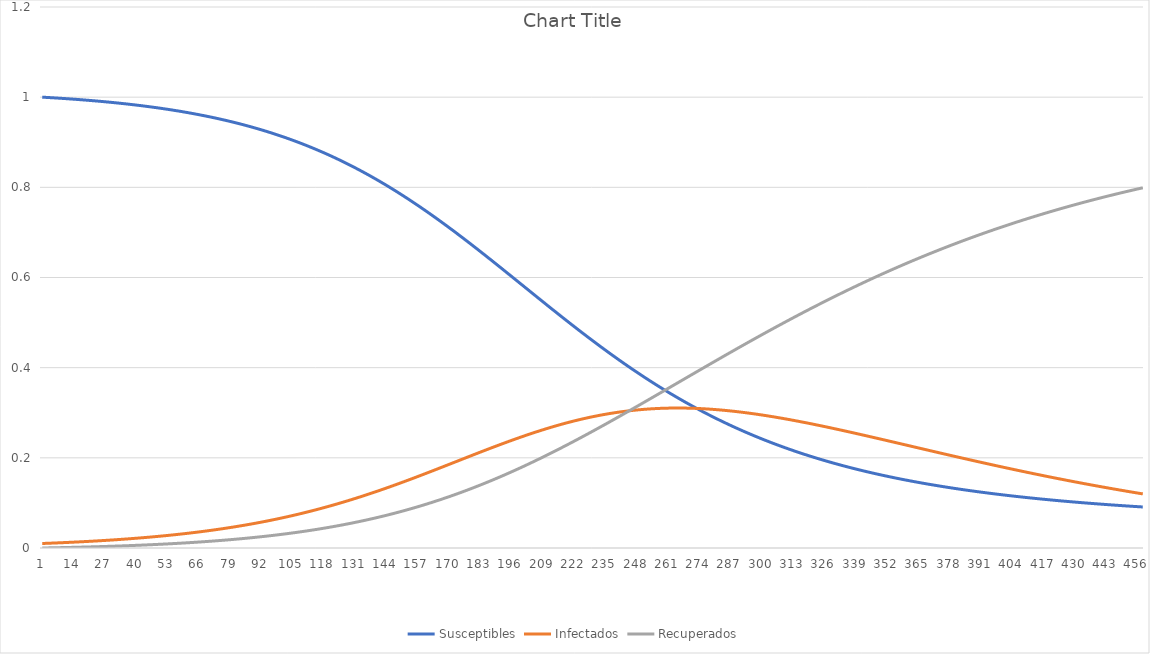
| Category | Susceptibles | Infectados | Recuperados |
|---|---|---|---|
| 0 | 1 | 0.01 | 0 |
| 1 | 1 | 0.01 | 0 |
| 2 | 0.999 | 0.01 | 0 |
| 3 | 0.999 | 0.011 | 0 |
| 4 | 0.999 | 0.011 | 0 |
| 5 | 0.998 | 0.011 | 0.001 |
| 6 | 0.998 | 0.011 | 0.001 |
| 7 | 0.998 | 0.011 | 0.001 |
| 8 | 0.997 | 0.012 | 0.001 |
| 9 | 0.997 | 0.012 | 0.001 |
| 10 | 0.997 | 0.012 | 0.001 |
| 11 | 0.996 | 0.012 | 0.001 |
| 12 | 0.996 | 0.013 | 0.001 |
| 13 | 0.996 | 0.013 | 0.001 |
| 14 | 0.995 | 0.013 | 0.002 |
| 15 | 0.995 | 0.013 | 0.002 |
| 16 | 0.994 | 0.014 | 0.002 |
| 17 | 0.994 | 0.014 | 0.002 |
| 18 | 0.994 | 0.014 | 0.002 |
| 19 | 0.993 | 0.015 | 0.002 |
| 20 | 0.993 | 0.015 | 0.002 |
| 21 | 0.992 | 0.015 | 0.003 |
| 22 | 0.992 | 0.015 | 0.003 |
| 23 | 0.991 | 0.016 | 0.003 |
| 24 | 0.991 | 0.016 | 0.003 |
| 25 | 0.99 | 0.016 | 0.003 |
| 26 | 0.99 | 0.017 | 0.003 |
| 27 | 0.989 | 0.017 | 0.004 |
| 28 | 0.989 | 0.017 | 0.004 |
| 29 | 0.988 | 0.018 | 0.004 |
| 30 | 0.988 | 0.018 | 0.004 |
| 31 | 0.987 | 0.018 | 0.004 |
| 32 | 0.987 | 0.019 | 0.004 |
| 33 | 0.986 | 0.019 | 0.005 |
| 34 | 0.986 | 0.02 | 0.005 |
| 35 | 0.985 | 0.02 | 0.005 |
| 36 | 0.984 | 0.02 | 0.005 |
| 37 | 0.984 | 0.021 | 0.005 |
| 38 | 0.983 | 0.021 | 0.006 |
| 39 | 0.982 | 0.022 | 0.006 |
| 40 | 0.982 | 0.022 | 0.006 |
| 41 | 0.981 | 0.022 | 0.006 |
| 42 | 0.981 | 0.023 | 0.007 |
| 43 | 0.98 | 0.023 | 0.007 |
| 44 | 0.979 | 0.024 | 0.007 |
| 45 | 0.978 | 0.024 | 0.007 |
| 46 | 0.978 | 0.025 | 0.008 |
| 47 | 0.977 | 0.025 | 0.008 |
| 48 | 0.976 | 0.026 | 0.008 |
| 49 | 0.975 | 0.026 | 0.008 |
| 50 | 0.975 | 0.027 | 0.009 |
| 51 | 0.974 | 0.027 | 0.009 |
| 52 | 0.973 | 0.028 | 0.009 |
| 53 | 0.972 | 0.028 | 0.009 |
| 54 | 0.971 | 0.029 | 0.01 |
| 55 | 0.971 | 0.029 | 0.01 |
| 56 | 0.97 | 0.03 | 0.01 |
| 57 | 0.969 | 0.031 | 0.011 |
| 58 | 0.968 | 0.031 | 0.011 |
| 59 | 0.967 | 0.032 | 0.011 |
| 60 | 0.966 | 0.032 | 0.011 |
| 61 | 0.965 | 0.033 | 0.012 |
| 62 | 0.964 | 0.034 | 0.012 |
| 63 | 0.963 | 0.034 | 0.012 |
| 64 | 0.962 | 0.035 | 0.013 |
| 65 | 0.961 | 0.036 | 0.013 |
| 66 | 0.96 | 0.036 | 0.014 |
| 67 | 0.959 | 0.037 | 0.014 |
| 68 | 0.958 | 0.038 | 0.014 |
| 69 | 0.957 | 0.038 | 0.015 |
| 70 | 0.956 | 0.039 | 0.015 |
| 71 | 0.955 | 0.04 | 0.015 |
| 72 | 0.954 | 0.041 | 0.016 |
| 73 | 0.952 | 0.041 | 0.016 |
| 74 | 0.951 | 0.042 | 0.017 |
| 75 | 0.95 | 0.043 | 0.017 |
| 76 | 0.949 | 0.044 | 0.018 |
| 77 | 0.948 | 0.045 | 0.018 |
| 78 | 0.946 | 0.045 | 0.018 |
| 79 | 0.945 | 0.046 | 0.019 |
| 80 | 0.944 | 0.047 | 0.019 |
| 81 | 0.942 | 0.048 | 0.02 |
| 82 | 0.941 | 0.049 | 0.02 |
| 83 | 0.94 | 0.05 | 0.021 |
| 84 | 0.938 | 0.051 | 0.021 |
| 85 | 0.937 | 0.052 | 0.022 |
| 86 | 0.935 | 0.052 | 0.022 |
| 87 | 0.934 | 0.053 | 0.023 |
| 88 | 0.932 | 0.054 | 0.023 |
| 89 | 0.931 | 0.055 | 0.024 |
| 90 | 0.929 | 0.056 | 0.025 |
| 91 | 0.928 | 0.057 | 0.025 |
| 92 | 0.926 | 0.058 | 0.026 |
| 93 | 0.924 | 0.059 | 0.026 |
| 94 | 0.923 | 0.061 | 0.027 |
| 95 | 0.921 | 0.062 | 0.027 |
| 96 | 0.919 | 0.063 | 0.028 |
| 97 | 0.917 | 0.064 | 0.029 |
| 98 | 0.916 | 0.065 | 0.029 |
| 99 | 0.914 | 0.066 | 0.03 |
| 100 | 0.912 | 0.067 | 0.031 |
| 101 | 0.91 | 0.068 | 0.031 |
| 102 | 0.908 | 0.07 | 0.032 |
| 103 | 0.906 | 0.071 | 0.033 |
| 104 | 0.905 | 0.072 | 0.033 |
| 105 | 0.903 | 0.073 | 0.034 |
| 106 | 0.901 | 0.075 | 0.035 |
| 107 | 0.899 | 0.076 | 0.036 |
| 108 | 0.896 | 0.077 | 0.036 |
| 109 | 0.894 | 0.078 | 0.037 |
| 110 | 0.892 | 0.08 | 0.038 |
| 111 | 0.89 | 0.081 | 0.039 |
| 112 | 0.888 | 0.082 | 0.04 |
| 113 | 0.886 | 0.084 | 0.04 |
| 114 | 0.883 | 0.085 | 0.041 |
| 115 | 0.881 | 0.087 | 0.042 |
| 116 | 0.879 | 0.088 | 0.043 |
| 117 | 0.877 | 0.09 | 0.044 |
| 118 | 0.874 | 0.091 | 0.045 |
| 119 | 0.872 | 0.092 | 0.046 |
| 120 | 0.869 | 0.094 | 0.047 |
| 121 | 0.867 | 0.096 | 0.048 |
| 122 | 0.864 | 0.097 | 0.049 |
| 123 | 0.862 | 0.099 | 0.05 |
| 124 | 0.859 | 0.1 | 0.051 |
| 125 | 0.857 | 0.102 | 0.052 |
| 126 | 0.854 | 0.103 | 0.053 |
| 127 | 0.851 | 0.105 | 0.054 |
| 128 | 0.849 | 0.107 | 0.055 |
| 129 | 0.846 | 0.108 | 0.056 |
| 130 | 0.843 | 0.11 | 0.057 |
| 131 | 0.84 | 0.112 | 0.058 |
| 132 | 0.838 | 0.113 | 0.059 |
| 133 | 0.835 | 0.115 | 0.06 |
| 134 | 0.832 | 0.117 | 0.061 |
| 135 | 0.829 | 0.119 | 0.063 |
| 136 | 0.826 | 0.12 | 0.064 |
| 137 | 0.823 | 0.122 | 0.065 |
| 138 | 0.82 | 0.124 | 0.066 |
| 139 | 0.817 | 0.126 | 0.067 |
| 140 | 0.814 | 0.128 | 0.069 |
| 141 | 0.811 | 0.129 | 0.07 |
| 142 | 0.807 | 0.131 | 0.071 |
| 143 | 0.804 | 0.133 | 0.073 |
| 144 | 0.801 | 0.135 | 0.074 |
| 145 | 0.798 | 0.137 | 0.075 |
| 146 | 0.794 | 0.139 | 0.077 |
| 147 | 0.791 | 0.141 | 0.078 |
| 148 | 0.788 | 0.143 | 0.08 |
| 149 | 0.784 | 0.145 | 0.081 |
| 150 | 0.781 | 0.147 | 0.082 |
| 151 | 0.777 | 0.149 | 0.084 |
| 152 | 0.774 | 0.151 | 0.085 |
| 153 | 0.77 | 0.153 | 0.087 |
| 154 | 0.767 | 0.155 | 0.088 |
| 155 | 0.763 | 0.157 | 0.09 |
| 156 | 0.76 | 0.159 | 0.092 |
| 157 | 0.756 | 0.161 | 0.093 |
| 158 | 0.752 | 0.163 | 0.095 |
| 159 | 0.749 | 0.165 | 0.096 |
| 160 | 0.745 | 0.167 | 0.098 |
| 161 | 0.741 | 0.169 | 0.1 |
| 162 | 0.738 | 0.171 | 0.101 |
| 163 | 0.734 | 0.173 | 0.103 |
| 164 | 0.73 | 0.175 | 0.105 |
| 165 | 0.726 | 0.177 | 0.107 |
| 166 | 0.722 | 0.179 | 0.108 |
| 167 | 0.718 | 0.181 | 0.11 |
| 168 | 0.714 | 0.183 | 0.112 |
| 169 | 0.71 | 0.186 | 0.114 |
| 170 | 0.706 | 0.188 | 0.116 |
| 171 | 0.702 | 0.19 | 0.118 |
| 172 | 0.698 | 0.192 | 0.12 |
| 173 | 0.694 | 0.194 | 0.122 |
| 174 | 0.69 | 0.196 | 0.123 |
| 175 | 0.686 | 0.198 | 0.125 |
| 176 | 0.682 | 0.2 | 0.127 |
| 177 | 0.678 | 0.202 | 0.129 |
| 178 | 0.674 | 0.204 | 0.132 |
| 179 | 0.67 | 0.207 | 0.134 |
| 180 | 0.666 | 0.209 | 0.136 |
| 181 | 0.662 | 0.211 | 0.138 |
| 182 | 0.657 | 0.213 | 0.14 |
| 183 | 0.653 | 0.215 | 0.142 |
| 184 | 0.649 | 0.217 | 0.144 |
| 185 | 0.645 | 0.219 | 0.146 |
| 186 | 0.64 | 0.221 | 0.149 |
| 187 | 0.636 | 0.223 | 0.151 |
| 188 | 0.632 | 0.225 | 0.153 |
| 189 | 0.628 | 0.227 | 0.155 |
| 190 | 0.623 | 0.229 | 0.158 |
| 191 | 0.619 | 0.231 | 0.16 |
| 192 | 0.615 | 0.233 | 0.162 |
| 193 | 0.611 | 0.235 | 0.164 |
| 194 | 0.606 | 0.237 | 0.167 |
| 195 | 0.602 | 0.239 | 0.169 |
| 196 | 0.598 | 0.241 | 0.172 |
| 197 | 0.593 | 0.243 | 0.174 |
| 198 | 0.589 | 0.245 | 0.176 |
| 199 | 0.585 | 0.246 | 0.179 |
| 200 | 0.58 | 0.248 | 0.181 |
| 201 | 0.576 | 0.25 | 0.184 |
| 202 | 0.572 | 0.252 | 0.186 |
| 203 | 0.567 | 0.254 | 0.189 |
| 204 | 0.563 | 0.256 | 0.191 |
| 205 | 0.559 | 0.257 | 0.194 |
| 206 | 0.554 | 0.259 | 0.197 |
| 207 | 0.55 | 0.261 | 0.199 |
| 208 | 0.546 | 0.262 | 0.202 |
| 209 | 0.541 | 0.264 | 0.204 |
| 210 | 0.537 | 0.266 | 0.207 |
| 211 | 0.533 | 0.267 | 0.21 |
| 212 | 0.529 | 0.269 | 0.212 |
| 213 | 0.524 | 0.27 | 0.215 |
| 214 | 0.52 | 0.272 | 0.218 |
| 215 | 0.516 | 0.273 | 0.221 |
| 216 | 0.512 | 0.275 | 0.223 |
| 217 | 0.507 | 0.276 | 0.226 |
| 218 | 0.503 | 0.278 | 0.229 |
| 219 | 0.499 | 0.279 | 0.232 |
| 220 | 0.495 | 0.281 | 0.234 |
| 221 | 0.491 | 0.282 | 0.237 |
| 222 | 0.487 | 0.283 | 0.24 |
| 223 | 0.482 | 0.285 | 0.243 |
| 224 | 0.478 | 0.286 | 0.246 |
| 225 | 0.474 | 0.287 | 0.249 |
| 226 | 0.47 | 0.288 | 0.252 |
| 227 | 0.466 | 0.289 | 0.254 |
| 228 | 0.462 | 0.291 | 0.257 |
| 229 | 0.458 | 0.292 | 0.26 |
| 230 | 0.454 | 0.293 | 0.263 |
| 231 | 0.45 | 0.294 | 0.266 |
| 232 | 0.446 | 0.295 | 0.269 |
| 233 | 0.442 | 0.296 | 0.272 |
| 234 | 0.438 | 0.297 | 0.275 |
| 235 | 0.434 | 0.298 | 0.278 |
| 236 | 0.431 | 0.299 | 0.281 |
| 237 | 0.427 | 0.299 | 0.284 |
| 238 | 0.423 | 0.3 | 0.287 |
| 239 | 0.419 | 0.301 | 0.29 |
| 240 | 0.415 | 0.302 | 0.293 |
| 241 | 0.412 | 0.303 | 0.296 |
| 242 | 0.408 | 0.303 | 0.299 |
| 243 | 0.404 | 0.304 | 0.302 |
| 244 | 0.4 | 0.304 | 0.305 |
| 245 | 0.397 | 0.305 | 0.308 |
| 246 | 0.393 | 0.306 | 0.311 |
| 247 | 0.39 | 0.306 | 0.314 |
| 248 | 0.386 | 0.307 | 0.317 |
| 249 | 0.383 | 0.307 | 0.32 |
| 250 | 0.379 | 0.308 | 0.323 |
| 251 | 0.376 | 0.308 | 0.326 |
| 252 | 0.372 | 0.308 | 0.33 |
| 253 | 0.369 | 0.309 | 0.333 |
| 254 | 0.365 | 0.309 | 0.336 |
| 255 | 0.362 | 0.309 | 0.339 |
| 256 | 0.359 | 0.31 | 0.342 |
| 257 | 0.355 | 0.31 | 0.345 |
| 258 | 0.352 | 0.31 | 0.348 |
| 259 | 0.349 | 0.31 | 0.351 |
| 260 | 0.345 | 0.31 | 0.354 |
| 261 | 0.342 | 0.31 | 0.357 |
| 262 | 0.339 | 0.31 | 0.361 |
| 263 | 0.336 | 0.31 | 0.364 |
| 264 | 0.333 | 0.31 | 0.367 |
| 265 | 0.33 | 0.31 | 0.37 |
| 266 | 0.327 | 0.31 | 0.373 |
| 267 | 0.324 | 0.31 | 0.376 |
| 268 | 0.321 | 0.31 | 0.379 |
| 269 | 0.318 | 0.31 | 0.382 |
| 270 | 0.315 | 0.31 | 0.385 |
| 271 | 0.312 | 0.31 | 0.388 |
| 272 | 0.309 | 0.31 | 0.392 |
| 273 | 0.306 | 0.309 | 0.395 |
| 274 | 0.303 | 0.309 | 0.398 |
| 275 | 0.3 | 0.309 | 0.401 |
| 276 | 0.298 | 0.308 | 0.404 |
| 277 | 0.295 | 0.308 | 0.407 |
| 278 | 0.292 | 0.308 | 0.41 |
| 279 | 0.29 | 0.307 | 0.413 |
| 280 | 0.287 | 0.307 | 0.416 |
| 281 | 0.284 | 0.306 | 0.419 |
| 282 | 0.282 | 0.306 | 0.422 |
| 283 | 0.279 | 0.305 | 0.425 |
| 284 | 0.277 | 0.305 | 0.428 |
| 285 | 0.274 | 0.304 | 0.432 |
| 286 | 0.272 | 0.304 | 0.435 |
| 287 | 0.269 | 0.303 | 0.438 |
| 288 | 0.267 | 0.303 | 0.441 |
| 289 | 0.264 | 0.302 | 0.444 |
| 290 | 0.262 | 0.301 | 0.447 |
| 291 | 0.259 | 0.301 | 0.45 |
| 292 | 0.257 | 0.3 | 0.453 |
| 293 | 0.255 | 0.299 | 0.456 |
| 294 | 0.253 | 0.299 | 0.459 |
| 295 | 0.25 | 0.298 | 0.462 |
| 296 | 0.248 | 0.297 | 0.465 |
| 297 | 0.246 | 0.296 | 0.468 |
| 298 | 0.244 | 0.296 | 0.471 |
| 299 | 0.242 | 0.295 | 0.474 |
| 300 | 0.239 | 0.294 | 0.476 |
| 301 | 0.237 | 0.293 | 0.479 |
| 302 | 0.235 | 0.292 | 0.482 |
| 303 | 0.233 | 0.292 | 0.485 |
| 304 | 0.231 | 0.291 | 0.488 |
| 305 | 0.229 | 0.29 | 0.491 |
| 306 | 0.227 | 0.289 | 0.494 |
| 307 | 0.225 | 0.288 | 0.497 |
| 308 | 0.223 | 0.287 | 0.5 |
| 309 | 0.221 | 0.286 | 0.503 |
| 310 | 0.22 | 0.285 | 0.505 |
| 311 | 0.218 | 0.284 | 0.508 |
| 312 | 0.216 | 0.283 | 0.511 |
| 313 | 0.214 | 0.282 | 0.514 |
| 314 | 0.212 | 0.281 | 0.517 |
| 315 | 0.21 | 0.28 | 0.52 |
| 316 | 0.209 | 0.279 | 0.522 |
| 317 | 0.207 | 0.278 | 0.525 |
| 318 | 0.205 | 0.277 | 0.528 |
| 319 | 0.204 | 0.276 | 0.531 |
| 320 | 0.202 | 0.275 | 0.533 |
| 321 | 0.2 | 0.274 | 0.536 |
| 322 | 0.199 | 0.273 | 0.539 |
| 323 | 0.197 | 0.271 | 0.542 |
| 324 | 0.195 | 0.27 | 0.544 |
| 325 | 0.194 | 0.269 | 0.547 |
| 326 | 0.192 | 0.268 | 0.55 |
| 327 | 0.191 | 0.267 | 0.552 |
| 328 | 0.189 | 0.266 | 0.555 |
| 329 | 0.188 | 0.265 | 0.558 |
| 330 | 0.186 | 0.263 | 0.56 |
| 331 | 0.185 | 0.262 | 0.563 |
| 332 | 0.183 | 0.261 | 0.566 |
| 333 | 0.182 | 0.26 | 0.568 |
| 334 | 0.18 | 0.259 | 0.571 |
| 335 | 0.179 | 0.258 | 0.573 |
| 336 | 0.178 | 0.256 | 0.576 |
| 337 | 0.176 | 0.255 | 0.578 |
| 338 | 0.175 | 0.254 | 0.581 |
| 339 | 0.174 | 0.253 | 0.584 |
| 340 | 0.172 | 0.252 | 0.586 |
| 341 | 0.171 | 0.25 | 0.589 |
| 342 | 0.17 | 0.249 | 0.591 |
| 343 | 0.169 | 0.248 | 0.594 |
| 344 | 0.167 | 0.247 | 0.596 |
| 345 | 0.166 | 0.245 | 0.599 |
| 346 | 0.165 | 0.244 | 0.601 |
| 347 | 0.164 | 0.243 | 0.603 |
| 348 | 0.162 | 0.242 | 0.606 |
| 349 | 0.161 | 0.24 | 0.608 |
| 350 | 0.16 | 0.239 | 0.611 |
| 351 | 0.159 | 0.238 | 0.613 |
| 352 | 0.158 | 0.237 | 0.615 |
| 353 | 0.157 | 0.236 | 0.618 |
| 354 | 0.156 | 0.234 | 0.62 |
| 355 | 0.155 | 0.233 | 0.622 |
| 356 | 0.153 | 0.232 | 0.625 |
| 357 | 0.152 | 0.231 | 0.627 |
| 358 | 0.151 | 0.229 | 0.629 |
| 359 | 0.15 | 0.228 | 0.632 |
| 360 | 0.149 | 0.227 | 0.634 |
| 361 | 0.148 | 0.226 | 0.636 |
| 362 | 0.147 | 0.224 | 0.638 |
| 363 | 0.146 | 0.223 | 0.641 |
| 364 | 0.145 | 0.222 | 0.643 |
| 365 | 0.144 | 0.221 | 0.645 |
| 366 | 0.143 | 0.219 | 0.647 |
| 367 | 0.142 | 0.218 | 0.65 |
| 368 | 0.142 | 0.217 | 0.652 |
| 369 | 0.141 | 0.216 | 0.654 |
| 370 | 0.14 | 0.214 | 0.656 |
| 371 | 0.139 | 0.213 | 0.658 |
| 372 | 0.138 | 0.212 | 0.66 |
| 373 | 0.137 | 0.211 | 0.662 |
| 374 | 0.136 | 0.209 | 0.664 |
| 375 | 0.135 | 0.208 | 0.667 |
| 376 | 0.135 | 0.207 | 0.669 |
| 377 | 0.134 | 0.206 | 0.671 |
| 378 | 0.133 | 0.204 | 0.673 |
| 379 | 0.132 | 0.203 | 0.675 |
| 380 | 0.131 | 0.202 | 0.677 |
| 381 | 0.13 | 0.201 | 0.679 |
| 382 | 0.13 | 0.199 | 0.681 |
| 383 | 0.129 | 0.198 | 0.683 |
| 384 | 0.128 | 0.197 | 0.685 |
| 385 | 0.127 | 0.196 | 0.687 |
| 386 | 0.127 | 0.195 | 0.689 |
| 387 | 0.126 | 0.193 | 0.691 |
| 388 | 0.125 | 0.192 | 0.693 |
| 389 | 0.125 | 0.191 | 0.694 |
| 390 | 0.124 | 0.19 | 0.696 |
| 391 | 0.123 | 0.189 | 0.698 |
| 392 | 0.122 | 0.187 | 0.7 |
| 393 | 0.122 | 0.186 | 0.702 |
| 394 | 0.121 | 0.185 | 0.704 |
| 395 | 0.12 | 0.184 | 0.706 |
| 396 | 0.12 | 0.183 | 0.708 |
| 397 | 0.119 | 0.182 | 0.709 |
| 398 | 0.118 | 0.18 | 0.711 |
| 399 | 0.118 | 0.179 | 0.713 |
| 400 | 0.117 | 0.178 | 0.715 |
| 401 | 0.117 | 0.177 | 0.717 |
| 402 | 0.116 | 0.176 | 0.718 |
| 403 | 0.115 | 0.175 | 0.72 |
| 404 | 0.115 | 0.173 | 0.722 |
| 405 | 0.114 | 0.172 | 0.724 |
| 406 | 0.114 | 0.171 | 0.725 |
| 407 | 0.113 | 0.17 | 0.727 |
| 408 | 0.112 | 0.169 | 0.729 |
| 409 | 0.112 | 0.168 | 0.73 |
| 410 | 0.111 | 0.167 | 0.732 |
| 411 | 0.111 | 0.166 | 0.734 |
| 412 | 0.11 | 0.165 | 0.735 |
| 413 | 0.11 | 0.163 | 0.737 |
| 414 | 0.109 | 0.162 | 0.739 |
| 415 | 0.109 | 0.161 | 0.74 |
| 416 | 0.108 | 0.16 | 0.742 |
| 417 | 0.108 | 0.159 | 0.743 |
| 418 | 0.107 | 0.158 | 0.745 |
| 419 | 0.106 | 0.157 | 0.747 |
| 420 | 0.106 | 0.156 | 0.748 |
| 421 | 0.105 | 0.155 | 0.75 |
| 422 | 0.105 | 0.154 | 0.751 |
| 423 | 0.105 | 0.153 | 0.753 |
| 424 | 0.104 | 0.152 | 0.754 |
| 425 | 0.104 | 0.151 | 0.756 |
| 426 | 0.103 | 0.15 | 0.757 |
| 427 | 0.103 | 0.149 | 0.759 |
| 428 | 0.102 | 0.148 | 0.76 |
| 429 | 0.102 | 0.147 | 0.762 |
| 430 | 0.101 | 0.145 | 0.763 |
| 431 | 0.101 | 0.144 | 0.765 |
| 432 | 0.1 | 0.143 | 0.766 |
| 433 | 0.1 | 0.142 | 0.768 |
| 434 | 0.1 | 0.141 | 0.769 |
| 435 | 0.099 | 0.14 | 0.77 |
| 436 | 0.099 | 0.14 | 0.772 |
| 437 | 0.098 | 0.139 | 0.773 |
| 438 | 0.098 | 0.138 | 0.775 |
| 439 | 0.098 | 0.137 | 0.776 |
| 440 | 0.097 | 0.136 | 0.777 |
| 441 | 0.097 | 0.135 | 0.779 |
| 442 | 0.096 | 0.134 | 0.78 |
| 443 | 0.096 | 0.133 | 0.781 |
| 444 | 0.096 | 0.132 | 0.783 |
| 445 | 0.095 | 0.131 | 0.784 |
| 446 | 0.095 | 0.13 | 0.785 |
| 447 | 0.094 | 0.129 | 0.787 |
| 448 | 0.094 | 0.128 | 0.788 |
| 449 | 0.094 | 0.127 | 0.789 |
| 450 | 0.093 | 0.126 | 0.79 |
| 451 | 0.093 | 0.125 | 0.792 |
| 452 | 0.093 | 0.124 | 0.793 |
| 453 | 0.092 | 0.124 | 0.794 |
| 454 | 0.092 | 0.123 | 0.795 |
| 455 | 0.092 | 0.122 | 0.797 |
| 456 | 0.091 | 0.121 | 0.798 |
| 457 | 0.091 | 0.12 | 0.799 |